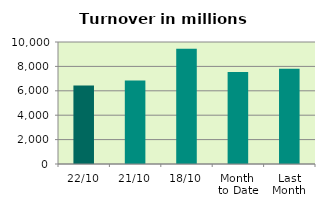
| Category | Series 0 |
|---|---|
| 22/10 | 6441.455 |
| 21/10 | 6844.351 |
| 18/10 | 9442.618 |
| Month 
to Date | 7542.141 |
| Last
Month | 7802.515 |